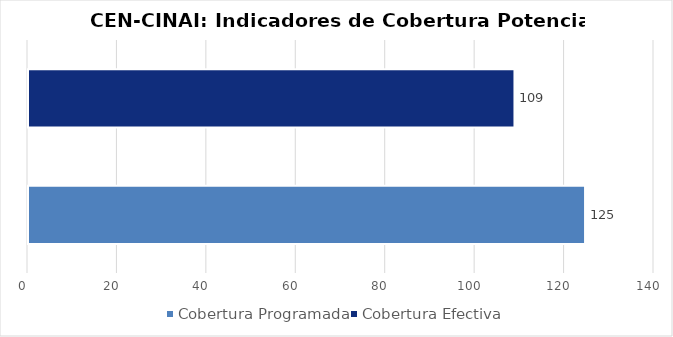
| Category | Series 0 |
|---|---|
| Cobertura Programada | 124.581 |
| Cobertura Efectiva | 108.794 |